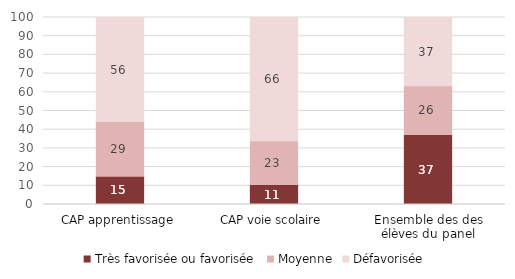
| Category | Très favorisée ou favorisée | Moyenne | Défavorisée |
|---|---|---|---|
| CAP apprentissage | 15.076 | 29.283 | 55.641 |
| CAP voie scolaire | 10.679 | 23.398 | 65.922 |
| Ensemble des des élèves du panel | 37.425 | 26.072 | 36.503 |